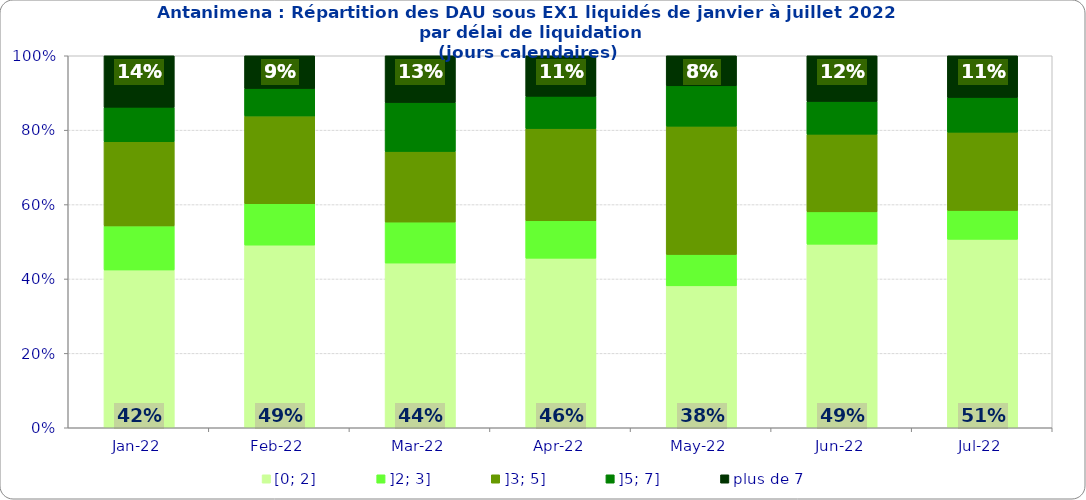
| Category | [0; 2] | ]2; 3] | ]3; 5] | ]5; 7] | plus de 7 |
|---|---|---|---|---|---|
| 2022-01-01 | 0.424 | 0.118 | 0.226 | 0.093 | 0.138 |
| 2022-02-01 | 0.491 | 0.111 | 0.236 | 0.074 | 0.088 |
| 2022-03-01 | 0.443 | 0.11 | 0.19 | 0.131 | 0.126 |
| 2022-04-01 | 0.456 | 0.101 | 0.248 | 0.087 | 0.109 |
| 2022-05-01 | 0.381 | 0.085 | 0.345 | 0.108 | 0.081 |
| 2022-06-01 | 0.494 | 0.087 | 0.209 | 0.088 | 0.123 |
| 2022-07-01 | 0.506 | 0.078 | 0.21 | 0.094 | 0.112 |